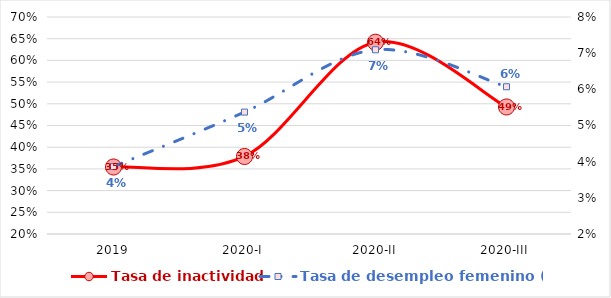
| Category | Tasa de inactividad |
|---|---|
| 2019 | 0.354 |
| 2020-I | 0.379 |
| 2020-II | 0.642 |
| 2020-III | 0.493 |